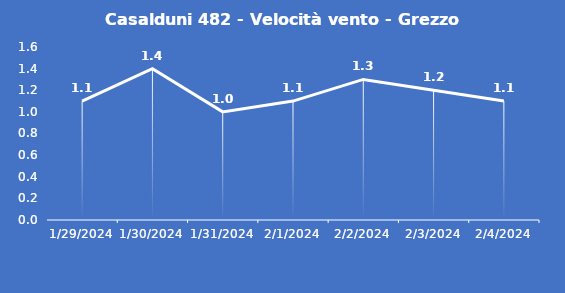
| Category | Casalduni 482 - Velocità vento - Grezzo (m/s) |
|---|---|
| 1/29/24 | 1.1 |
| 1/30/24 | 1.4 |
| 1/31/24 | 1 |
| 2/1/24 | 1.1 |
| 2/2/24 | 1.3 |
| 2/3/24 | 1.2 |
| 2/4/24 | 1.1 |